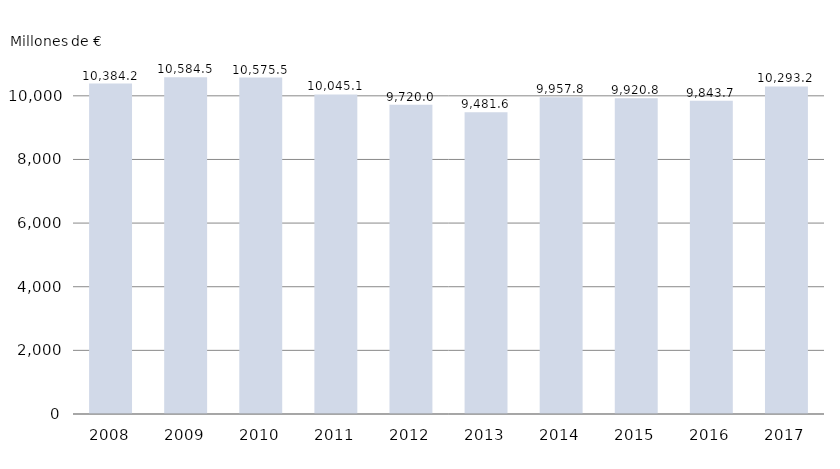
| Category | Evolución del presupuesto consolidado de la Comunidad de Castilla y León, 2008-2017 |
|---|---|
| 2008.0 | 10384241.1 |
| 2009.0 | 10584541 |
| 2010.0 | 10575537 |
| 2011.0 | 10045146 |
| 2012.0 | 9720048.42 |
| 2013.0 | 9481615.09 |
| 2014.0 | 9957790.752 |
| 2015.0 | 9920811.756 |
| 2016.0 | 9843699.243 |
| 2017.0 | 10293186.36 |